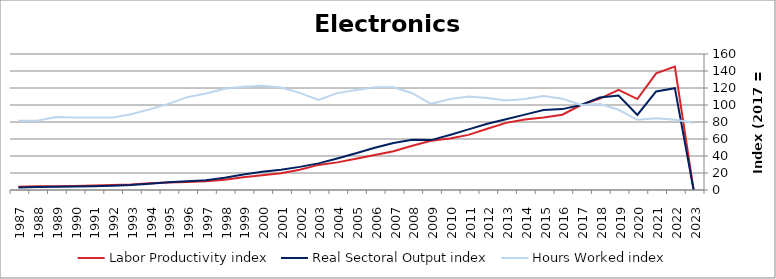
| Category | Labor Productivity index | Real Sectoral Output index | Hours Worked index |
|---|---|---|---|
| 2023.0 | 0 | 0 | 79.207 |
| 2022.0 | 145.23 | 119.828 | 82.51 |
| 2021.0 | 137.156 | 115.939 | 84.531 |
| 2020.0 | 106.993 | 88.373 | 82.597 |
| 2019.0 | 117.686 | 111.108 | 94.41 |
| 2018.0 | 107.498 | 108.76 | 101.174 |
| 2017.0 | 100 | 100 | 100 |
| 2016.0 | 88.566 | 95.157 | 107.442 |
| 2015.0 | 85.191 | 94.127 | 110.489 |
| 2014.0 | 82.907 | 88.66 | 106.939 |
| 2013.0 | 79.001 | 83.201 | 105.317 |
| 2012.0 | 72.021 | 77.901 | 108.164 |
| 2011.0 | 64.859 | 71.329 | 109.977 |
| 2010.0 | 60.616 | 64.799 | 106.901 |
| 2009.0 | 57.9 | 58.691 | 101.365 |
| 2008.0 | 51.963 | 59.161 | 113.852 |
| 2007.0 | 45.69 | 55.236 | 120.893 |
| 2006.0 | 41.137 | 49.7 | 120.815 |
| 2005.0 | 36.732 | 43.258 | 117.767 |
| 2004.0 | 32.506 | 37.044 | 113.961 |
| 2003.0 | 29.548 | 31.313 | 105.972 |
| 2002.0 | 23.807 | 27.207 | 114.28 |
| 2001.0 | 19.824 | 23.91 | 120.611 |
| 2000.0 | 17.452 | 21.399 | 122.615 |
| 1999.0 | 15.027 | 18.251 | 121.454 |
| 1998.0 | 12.178 | 14.499 | 119.058 |
| 1997.0 | 10.146 | 11.518 | 113.522 |
| 1996.0 | 9.433 | 10.303 | 109.219 |
| 1995.0 | 8.92 | 9.042 | 101.37 |
| 1994.0 | 7.825 | 7.42 | 94.82 |
| 1993.0 | 6.519 | 5.816 | 89.216 |
| 1992.0 | 5.747 | 4.894 | 85.166 |
| 1991.0 | 5.161 | 4.401 | 85.275 |
| 1990.0 | 4.802 | 4.103 | 85.434 |
| 1989.0 | 4.466 | 3.833 | 85.819 |
| 1988.0 | 4.315 | 3.519 | 81.571 |
| 1987.0 | 3.68 | 3.003 | 81.598 |